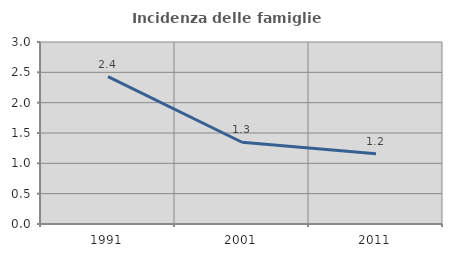
| Category | Incidenza delle famiglie numerose |
|---|---|
| 1991.0 | 2.429 |
| 2001.0 | 1.348 |
| 2011.0 | 1.158 |